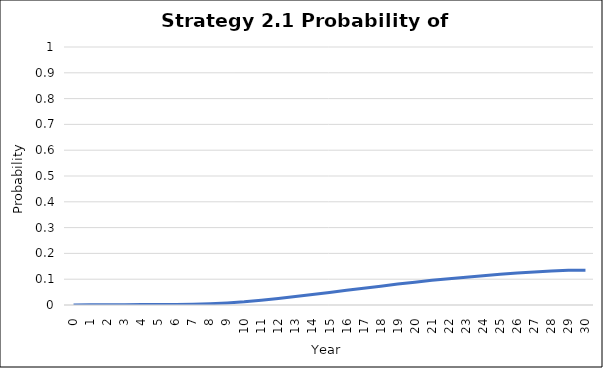
| Category | Series 0 |
|---|---|
| 0.0 | 0 |
| 1.0 | 0.001 |
| 2.0 | 0.001 |
| 3.0 | 0.001 |
| 4.0 | 0.001 |
| 5.0 | 0.002 |
| 6.0 | 0.002 |
| 7.0 | 0.003 |
| 8.0 | 0.005 |
| 9.0 | 0.008 |
| 10.0 | 0.012 |
| 11.0 | 0.018 |
| 12.0 | 0.025 |
| 13.0 | 0.033 |
| 14.0 | 0.04 |
| 15.0 | 0.048 |
| 16.0 | 0.057 |
| 17.0 | 0.065 |
| 18.0 | 0.073 |
| 19.0 | 0.081 |
| 20.0 | 0.088 |
| 21.0 | 0.096 |
| 22.0 | 0.102 |
| 23.0 | 0.108 |
| 24.0 | 0.114 |
| 25.0 | 0.119 |
| 26.0 | 0.124 |
| 27.0 | 0.128 |
| 28.0 | 0.131 |
| 29.0 | 0.135 |
| 30.0 | 0.135 |